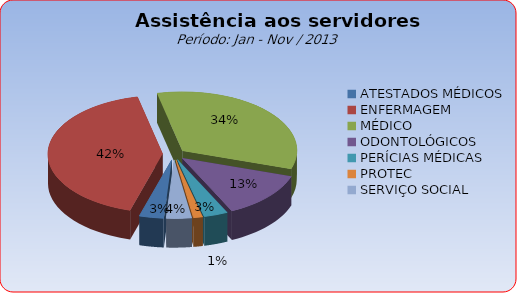
| Category | Series 0 |
|---|---|
| ATESTADOS MÉDICOS | 3.456 |
| ENFERMAGEM | 41.903 |
| MÉDICO | 33.565 |
| ODONTOLÓGICOS | 12.842 |
| PERÍCIAS MÉDICAS | 3.377 |
| PROTEC | 1.296 |
| SERVIÇO SOCIAL | 3.561 |